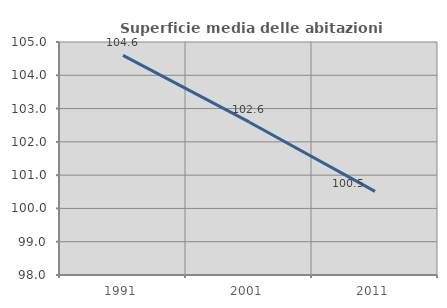
| Category | Superficie media delle abitazioni occupate |
|---|---|
| 1991.0 | 104.596 |
| 2001.0 | 102.598 |
| 2011.0 | 100.513 |